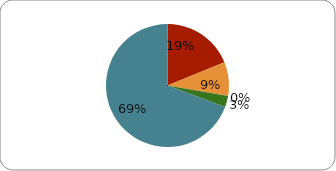
| Category | Series 0 |
|---|---|
| 0 | 0.19 |
| 1 | 0.09 |
| 2 | 0 |
| 3 | 0.03 |
| 4 | 0.7 |